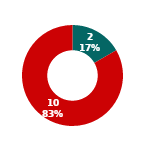
| Category | Total |
|---|---|
| MIL 3 AP Not Present | 2 |
| MIL 3 AP Present | 10 |